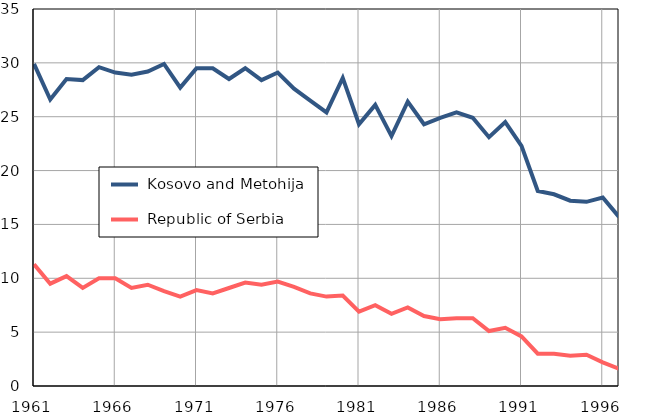
| Category |  Kosovo and Metohija |  Republic of Serbia |
|---|---|---|
| 1961.0 | 29.9 | 11.3 |
| 1962.0 | 26.6 | 9.5 |
| 1963.0 | 28.5 | 10.2 |
| 1964.0 | 28.4 | 9.1 |
| 1965.0 | 29.6 | 10 |
| 1966.0 | 29.1 | 10 |
| 1967.0 | 28.9 | 9.1 |
| 1968.0 | 29.2 | 9.4 |
| 1969.0 | 29.9 | 8.8 |
| 1970.0 | 27.7 | 8.3 |
| 1971.0 | 29.5 | 8.9 |
| 1972.0 | 29.5 | 8.6 |
| 1973.0 | 28.5 | 9.1 |
| 1974.0 | 29.5 | 9.6 |
| 1975.0 | 28.4 | 9.4 |
| 1976.0 | 29.1 | 9.7 |
| 1977.0 | 27.6 | 9.2 |
| 1978.0 | 26.5 | 8.6 |
| 1979.0 | 25.4 | 8.3 |
| 1980.0 | 28.6 | 8.4 |
| 1981.0 | 24.3 | 6.9 |
| 1982.0 | 26.1 | 7.5 |
| 1983.0 | 23.2 | 6.7 |
| 1984.0 | 26.4 | 7.3 |
| 1985.0 | 24.3 | 6.5 |
| 1986.0 | 24.9 | 6.2 |
| 1987.0 | 25.4 | 6.3 |
| 1988.0 | 24.9 | 6.3 |
| 1989.0 | 23.1 | 5.1 |
| 1990.0 | 24.5 | 5.4 |
| 1991.0 | 22.3 | 4.6 |
| 1992.0 | 18.1 | 3 |
| 1993.0 | 17.8 | 3 |
| 1994.0 | 17.2 | 2.8 |
| 1995.0 | 17.1 | 2.9 |
| 1996.0 | 17.5 | 2.2 |
| 1997.0 | 15.7 | 1.6 |